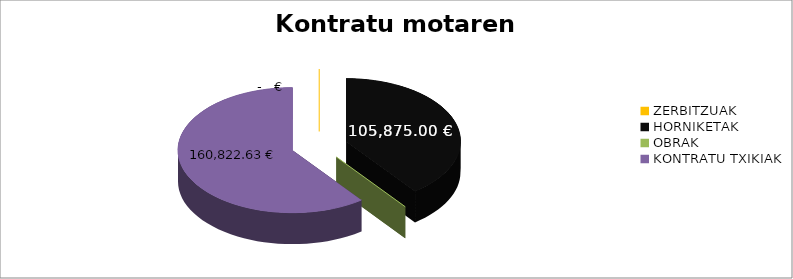
| Category | Kontratu motaren arabera |
|---|---|
| ZERBITZUAK | 0 |
| HORNIKETAK | 105875 |
| OBRAK | 0 |
| KONTRATU TXIKIAK | 160822.63 |